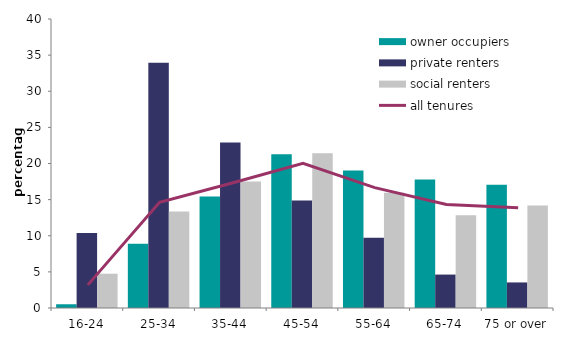
| Category | owner occupiers | private renters | social renters |
|---|---|---|---|
| 16-24 | 0.518 | 10.363 | 4.746 |
| 25-34 | 8.877 | 33.939 | 13.36 |
| 35-44 | 15.427 | 22.923 | 17.505 |
| 45-54 | 21.264 | 14.886 | 21.417 |
| 55-64 | 19.047 | 9.724 | 15.95 |
| 65-74 | 17.799 | 4.627 | 12.841 |
| 75 or over | 17.068 | 3.538 | 14.181 |